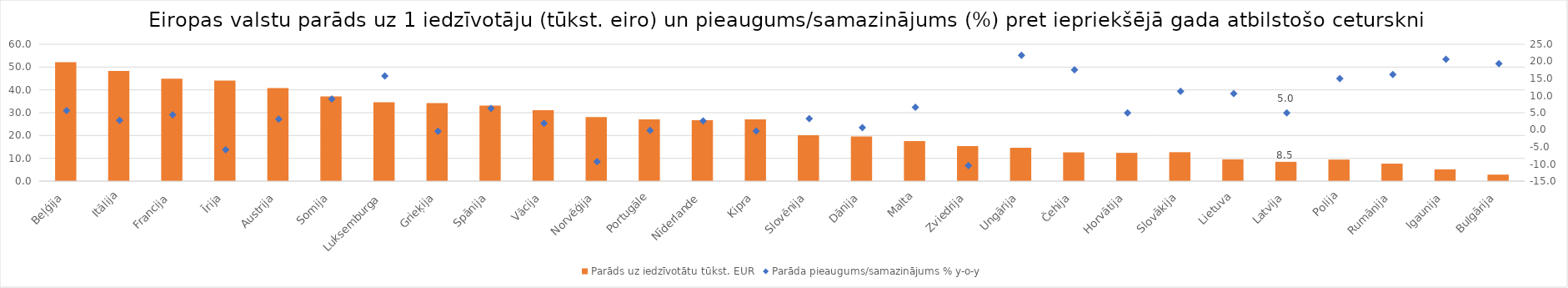
| Category | Parāds uz iedzīvotātu tūkst. EUR |
|---|---|
|  Beļģija | 52.102 |
| Itālija | 48.258 |
| Francija | 44.892 |
| Īrija | 44.06 |
|  Austrija | 40.762 |
| Somija | 37.122 |
| Luksemburga | 34.56 |
| Grieķija | 34.231 |
| Spānija | 33.073 |
| Vācija | 31.059 |
| Norvēģija | 28.125 |
| Portugāle | 27.046 |
| Nīderlande | 26.717 |
| Kipra | 27.094 |
| Slovēnija | 20.117 |
| Dānija | 19.611 |
| Malta | 17.585 |
| Zviedrija | 15.379 |
| Ungārija | 14.632 |
|  Čehija | 12.618 |
| Horvātija | 12.402 |
| Slovākija | 12.69 |
| Lietuva | 9.548 |
| Latvija | 8.475 |
| Polija | 9.46 |
| Rumānija | 7.666 |
| Igaunija | 5.163 |
|  Bulgārija | 2.869 |